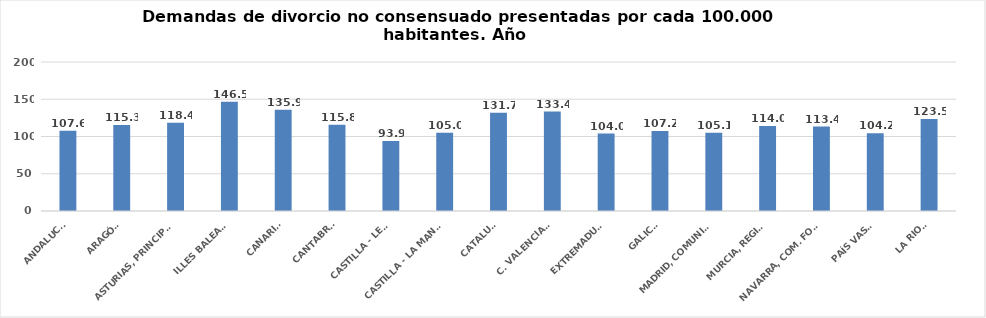
| Category | Series 0 |
|---|---|
| ANDALUCÍA | 107.585 |
| ARAGÓN | 115.282 |
| ASTURIAS, PRINCIPADO | 118.445 |
| ILLES BALEARS | 146.517 |
| CANARIAS | 135.877 |
| CANTABRIA | 115.818 |
| CASTILLA - LEÓN | 93.862 |
| CASTILLA - LA MANCHA | 105.049 |
| CATALUÑA | 131.715 |
| C. VALENCIANA | 133.406 |
| EXTREMADURA | 104.003 |
| GALICIA | 107.231 |
| MADRID, COMUNIDAD | 105.076 |
| MURCIA, REGIÓN | 113.978 |
| NAVARRA, COM. FORAL | 113.384 |
| PAÍS VASCO | 104.249 |
| LA RIOJA | 123.479 |